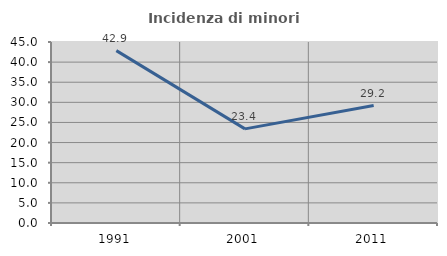
| Category | Incidenza di minori stranieri |
|---|---|
| 1991.0 | 42.857 |
| 2001.0 | 23.404 |
| 2011.0 | 29.197 |